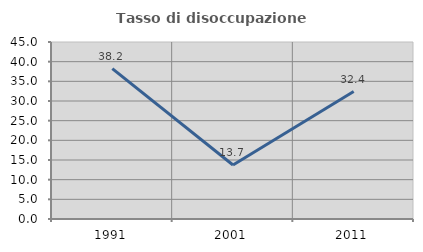
| Category | Tasso di disoccupazione giovanile  |
|---|---|
| 1991.0 | 38.218 |
| 2001.0 | 13.725 |
| 2011.0 | 32.409 |